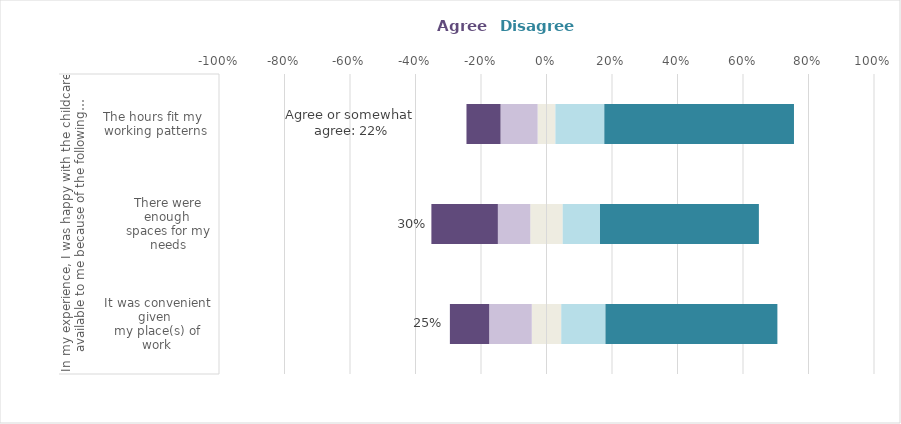
| Category | Neither agree nor disagree | Somewhat agree | Agree | Somewhat disagree | Disagree |
|---|---|---|---|---|---|
| 0 | 0.045 | -0.13 | -0.12 | 0.135 | 0.525 |
| 1 | 0.05 | -0.099 | -0.203 | 0.114 | 0.485 |
| 2 | 0.027 | -0.113 | -0.104 | 0.149 | 0.579 |